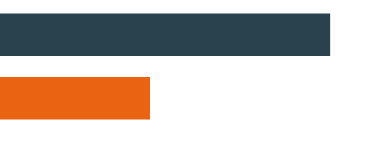
| Category | Series 0 |
|---|---|
| 0 | 1209500 |
| 1 | 547500 |